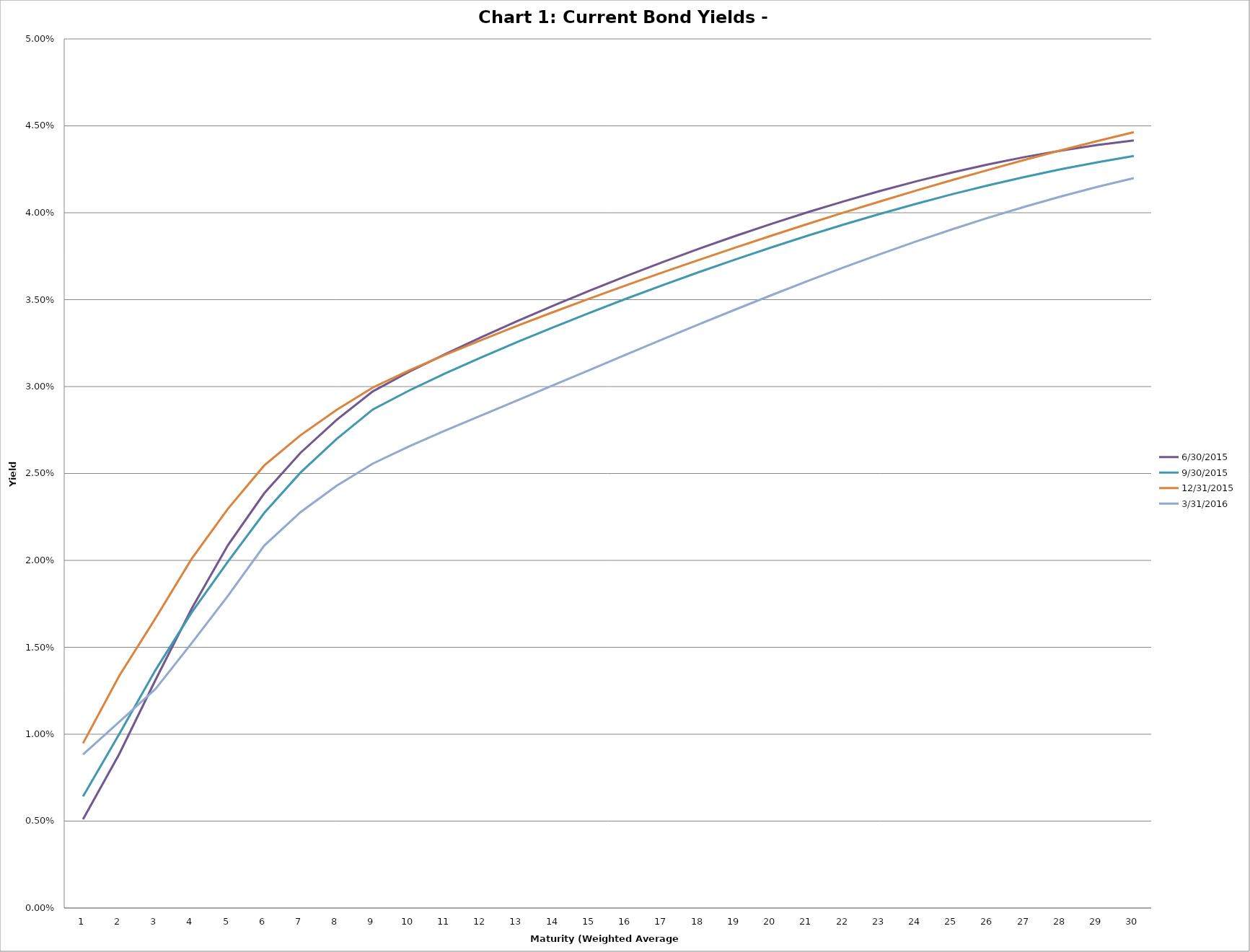
| Category | 6/30/2015 | 9/30/2015 | 12/31/2015 | 3/31/2016 |
|---|---|---|---|---|
| 0 | 0.005 | 0.006 | 0.009 | 0.009 |
| 1 | 0.009 | 0.01 | 0.013 | 0.011 |
| 2 | 0.013 | 0.014 | 0.017 | 0.013 |
| 3 | 0.017 | 0.017 | 0.02 | 0.015 |
| 4 | 0.021 | 0.02 | 0.023 | 0.018 |
| 5 | 0.024 | 0.023 | 0.025 | 0.021 |
| 6 | 0.026 | 0.025 | 0.027 | 0.023 |
| 7 | 0.028 | 0.027 | 0.029 | 0.024 |
| 8 | 0.03 | 0.029 | 0.03 | 0.026 |
| 9 | 0.031 | 0.03 | 0.031 | 0.027 |
| 10 | 0.032 | 0.031 | 0.032 | 0.027 |
| 11 | 0.033 | 0.032 | 0.033 | 0.028 |
| 12 | 0.034 | 0.033 | 0.034 | 0.029 |
| 13 | 0.035 | 0.033 | 0.034 | 0.03 |
| 14 | 0.036 | 0.034 | 0.035 | 0.031 |
| 15 | 0.036 | 0.035 | 0.036 | 0.032 |
| 16 | 0.037 | 0.036 | 0.037 | 0.033 |
| 17 | 0.038 | 0.037 | 0.037 | 0.034 |
| 18 | 0.039 | 0.037 | 0.038 | 0.034 |
| 19 | 0.039 | 0.038 | 0.039 | 0.035 |
| 20 | 0.04 | 0.039 | 0.039 | 0.036 |
| 21 | 0.041 | 0.039 | 0.04 | 0.037 |
| 22 | 0.041 | 0.04 | 0.041 | 0.038 |
| 23 | 0.042 | 0.041 | 0.041 | 0.038 |
| 24 | 0.042 | 0.041 | 0.042 | 0.039 |
| 25 | 0.043 | 0.042 | 0.042 | 0.04 |
| 26 | 0.043 | 0.042 | 0.043 | 0.04 |
| 27 | 0.044 | 0.043 | 0.044 | 0.041 |
| 28 | 0.044 | 0.043 | 0.044 | 0.041 |
| 29 | 0.044 | 0.043 | 0.045 | 0.042 |